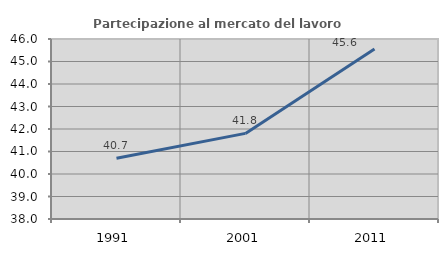
| Category | Partecipazione al mercato del lavoro  femminile |
|---|---|
| 1991.0 | 40.697 |
| 2001.0 | 41.805 |
| 2011.0 | 45.553 |